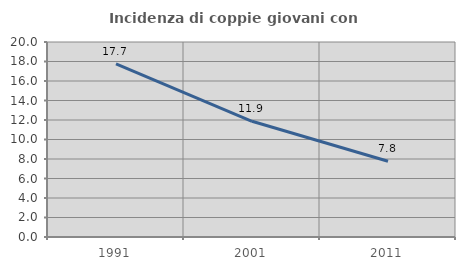
| Category | Incidenza di coppie giovani con figli |
|---|---|
| 1991.0 | 17.748 |
| 2001.0 | 11.866 |
| 2011.0 | 7.771 |